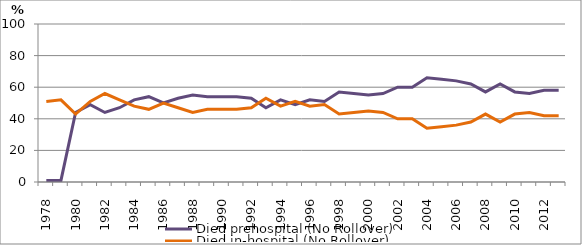
| Category | Died prehospital (No Rollover) | Died in-hospital (No Rollover) |
|---|---|---|
| 1978.0 | 1 | 51 |
| 1979.0 | 1 | 52 |
| 1980.0 | 44 | 43 |
| 1981.0 | 49 | 51 |
| 1982.0 | 44 | 56 |
| 1983.0 | 47 | 52 |
| 1984.0 | 52 | 48 |
| 1985.0 | 54 | 46 |
| 1986.0 | 50 | 50 |
| 1987.0 | 53 | 47 |
| 1988.0 | 55 | 44 |
| 1989.0 | 54 | 46 |
| 1990.0 | 54 | 46 |
| 1991.0 | 54 | 46 |
| 1992.0 | 53 | 47 |
| 1993.0 | 47 | 53 |
| 1994.0 | 52 | 48 |
| 1995.0 | 49 | 51 |
| 1996.0 | 52 | 48 |
| 1997.0 | 51 | 49 |
| 1998.0 | 57 | 43 |
| 1999.0 | 56 | 44 |
| 2000.0 | 55 | 45 |
| 2001.0 | 56 | 44 |
| 2002.0 | 60 | 40 |
| 2003.0 | 60 | 40 |
| 2004.0 | 66 | 34 |
| 2005.0 | 65 | 35 |
| 2006.0 | 64 | 36 |
| 2007.0 | 62 | 38 |
| 2008.0 | 57 | 43 |
| 2009.0 | 62 | 38 |
| 2010.0 | 57 | 43 |
| 2011.0 | 56 | 44 |
| 2012.0 | 58 | 42 |
| 2013.0 | 58 | 42 |